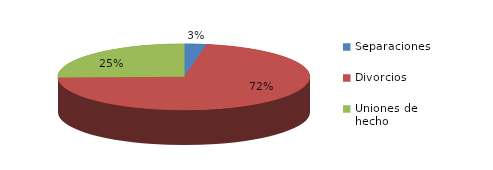
| Category | Series 0 |
|---|---|
| Separaciones | 6 |
| Divorcios | 150 |
| Uniones de hecho | 53 |